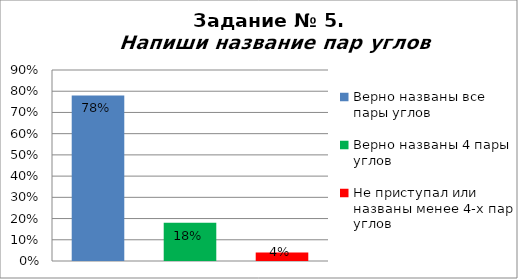
| Category | Напиши название пар углов |
|---|---|
| Верно названы все пары углов | 0.78 |
| Верно названы 4 пары углов | 0.18 |
| Не приступал или названы менее 4-х пар углов | 0.04 |